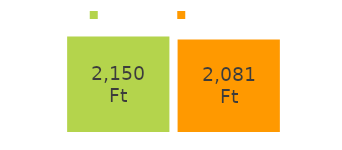
| Category | bejövő | kimenő |
|---|---|---|
| bejövő pénz: | 2150 | 2081 |